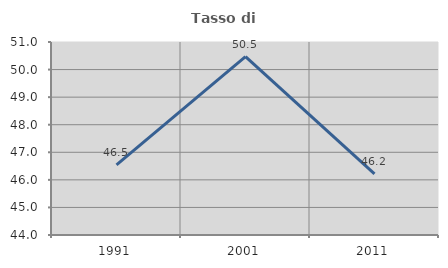
| Category | Tasso di occupazione   |
|---|---|
| 1991.0 | 46.545 |
| 2001.0 | 50.471 |
| 2011.0 | 46.221 |